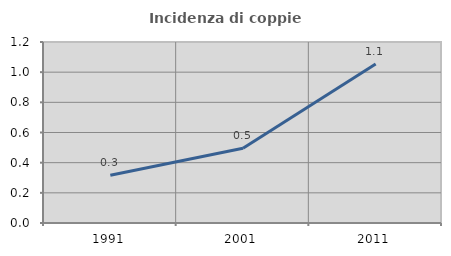
| Category | Incidenza di coppie miste |
|---|---|
| 1991.0 | 0.316 |
| 2001.0 | 0.496 |
| 2011.0 | 1.054 |